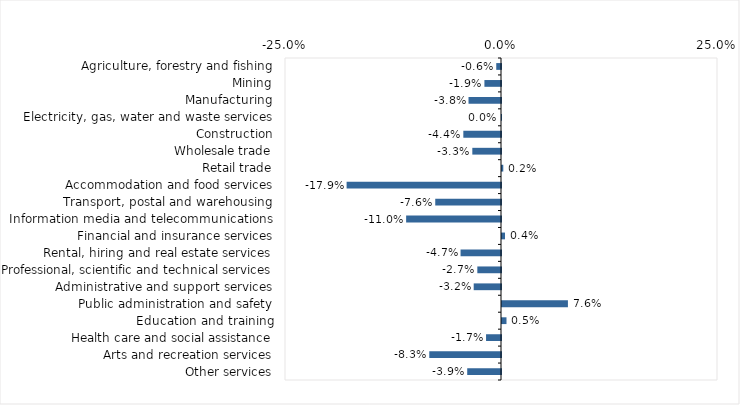
| Category | This week |
|---|---|
| Agriculture, forestry and fishing | -0.006 |
| Mining | -0.019 |
| Manufacturing | -0.038 |
| Electricity, gas, water and waste services | 0 |
| Construction | -0.044 |
| Wholesale trade | -0.033 |
| Retail trade | 0.002 |
| Accommodation and food services | -0.179 |
| Transport, postal and warehousing | -0.076 |
| Information media and telecommunications | -0.11 |
| Financial and insurance services | 0.004 |
| Rental, hiring and real estate services | -0.047 |
| Professional, scientific and technical services | -0.027 |
| Administrative and support services | -0.032 |
| Public administration and safety | 0.076 |
| Education and training | 0.005 |
| Health care and social assistance | -0.017 |
| Arts and recreation services | -0.083 |
| Other services | -0.039 |